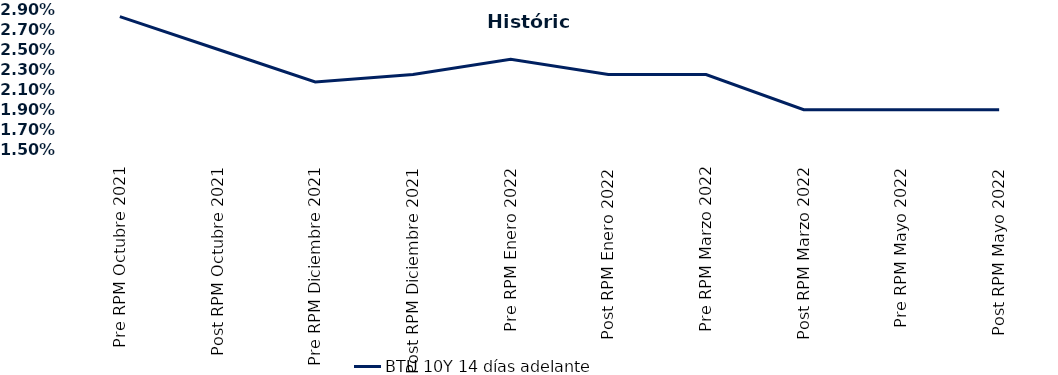
| Category | BTU 10Y 14 días adelante |
|---|---|
| Pre RPM Octubre 2021 | 0.028 |
| Post RPM Octubre 2021 | 0.025 |
| Pre RPM Diciembre 2021 | 0.022 |
| Post RPM Diciembre 2021 | 0.022 |
| Pre RPM Enero 2022 | 0.024 |
| Post RPM Enero 2022 | 0.022 |
| Pre RPM Marzo 2022 | 0.022 |
| Post RPM Marzo 2022 | 0.019 |
| Pre RPM Mayo 2022 | 0.019 |
| Post RPM Mayo 2022 | 0.019 |